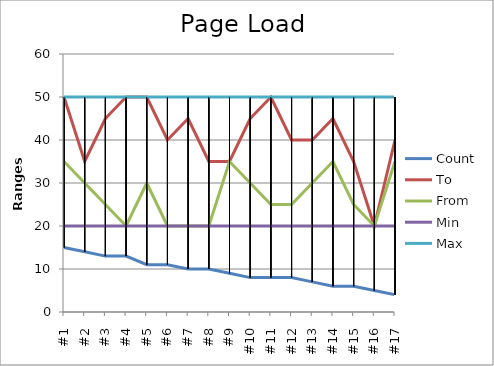
| Category | Count | To | From | Min | Max |
|---|---|---|---|---|---|
| #1 | 15 | 50 | 35 | 20 | 50 |
| #2 | 14 | 35 | 30 | 20 | 50 |
| #3 | 13 | 45 | 25 | 20 | 50 |
| #4 | 13 | 50 | 20 | 20 | 50 |
| #5 | 11 | 50 | 30 | 20 | 50 |
| #6 | 11 | 40 | 20 | 20 | 50 |
| #7 | 10 | 45 | 20 | 20 | 50 |
| #8 | 10 | 35 | 20 | 20 | 50 |
| #9 | 9 | 35 | 35 | 20 | 50 |
| #10 | 8 | 45 | 30 | 20 | 50 |
| #11 | 8 | 50 | 25 | 20 | 50 |
| #12 | 8 | 40 | 25 | 20 | 50 |
| #13 | 7 | 40 | 30 | 20 | 50 |
| #14 | 6 | 45 | 35 | 20 | 50 |
| #15 | 6 | 35 | 25 | 20 | 50 |
| #16 | 5 | 20 | 20 | 20 | 50 |
| #17 | 4 | 40 | 35 | 20 | 50 |